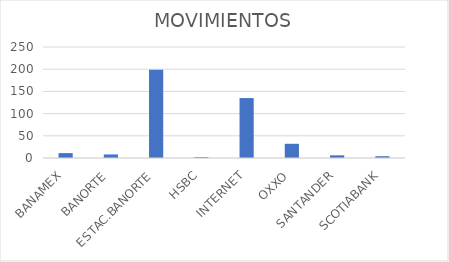
| Category | MOVIMIENTOS |
|---|---|
| BANAMEX | 11 |
| BANORTE | 8 |
| ESTAC.BANORTE | 199 |
| HSBC | 2 |
| INTERNET | 135 |
| OXXO | 32 |
| SANTANDER | 6 |
| SCOTIABANK | 4 |